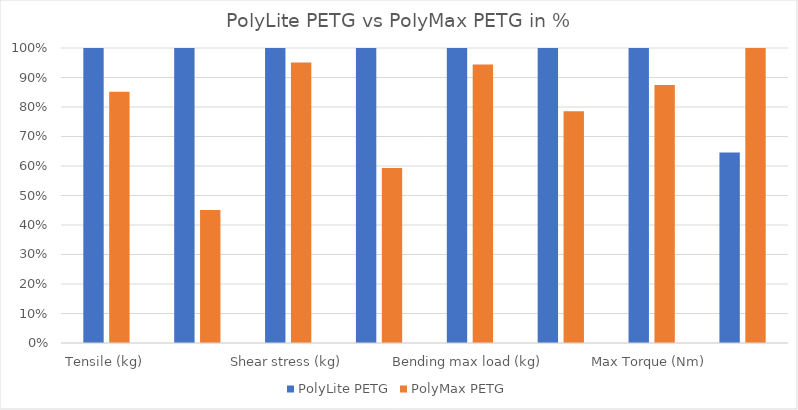
| Category | PolyLite PETG | PolyMax PETG |
|---|---|---|
| Tensile (kg) | 1 | 0.852 |
| Layer adhesion (kg) | 1 | 0.451 |
| Shear stress (kg) | 1 | 0.951 |
| Bending 2mm deform (kg) | 1 | 0.593 |
| Bending max load (kg) | 1 | 0.944 |
| Torque 90° (Nm) | 1 | 0.786 |
| Max Torque (Nm) | 1 | 0.875 |
| IZOD impact test kJ/m2 | 0.646 | 1 |